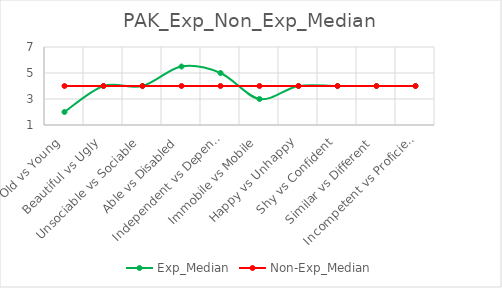
| Category | Exp_Median | Non-Exp_Median |
|---|---|---|
| Old vs Young | 2 | 4 |
|  Beautiful vs Ugly | 4 | 4 |
| Unsociable vs Sociable | 4 | 4 |
| Able vs Disabled | 5.5 | 4 |
| Independent vs Dependent | 5 | 4 |
| Immobile vs Mobile | 3 | 4 |
| Happy vs Unhappy | 4 | 4 |
| Shy vs Confident | 4 | 4 |
| Similar vs Different | 4 | 4 |
| Incompetent vs Proficient | 4 | 4 |